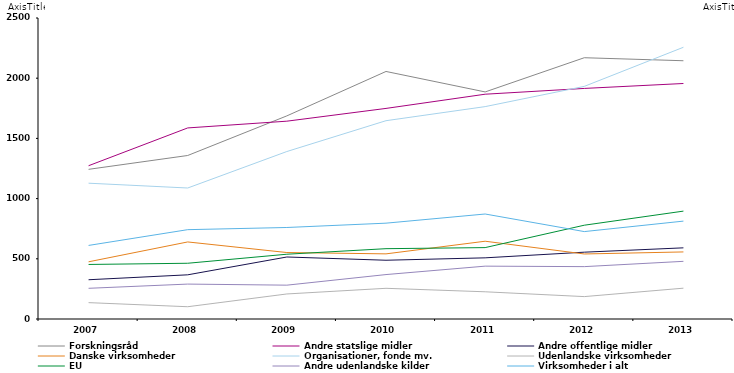
| Category | Forskningsråd | Andre statslige midler | Andre offentlige midler | Danske virksomheder | Organisationer, fonde mv. | Udenlandske virksomheder | EU | Andre udenlandske kilder | Virksomheder i alt |
|---|---|---|---|---|---|---|---|---|---|
| 2007 | 1243 | 1273 | 326 | 475 | 1128 | 136 | 453 | 255 | 611 |
| 2008 | 1358 | 1587 | 367 | 640 | 1088 | 102 | 463 | 290 | 742 |
| 2009 | 1687 | 1643 | 515 | 552 | 1391 | 208 | 538 | 281 | 760 |
| 2010 | 2056 | 1749 | 488 | 541 | 1647 | 255 | 584 | 369 | 796 |
| 2011 | 1886 | 1867 | 508 | 646 | 1764 | 226 | 593 | 439 | 872 |
| 2012 | 2170 | 1915 | 555 | 540 | 1932 | 186 | 779 | 435 | 726 |
| 2013 | 2145 | 1956 | 591 | 557 | 2257 | 256 | 896 | 479 | 813 |